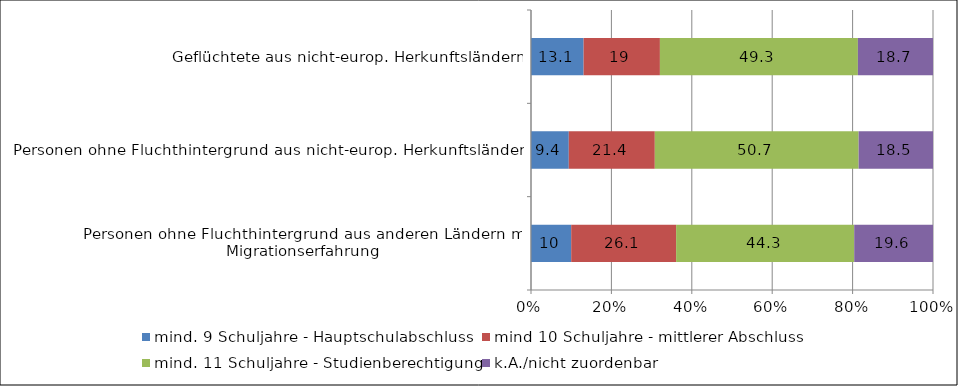
| Category | mind. 9 Schuljahre - Hauptschulabschluss | mind 10 Schuljahre - mittlerer Abschluss | mind. 11 Schuljahre - Studienberechtigung | k.A./nicht zuordenbar |
|---|---|---|---|---|
| Personen ohne Fluchthintergrund aus anderen Ländern mit Migrationserfahrung | 10 | 26.1 | 44.3 | 19.6 |
| Personen ohne Fluchthintergrund aus nicht-europ. Herkunftsländern | 9.4 | 21.4 | 50.7 | 18.5 |
| Geflüchtete aus nicht-europ. Herkunftsländern | 13.1 | 19 | 49.3 | 18.7 |